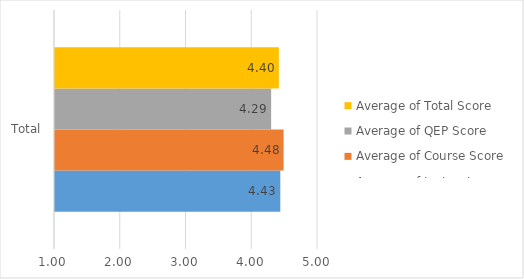
| Category | Average of Instructor Score | Average of Course Score | Average of QEP Score | Average of Total Score |
|---|---|---|---|---|
| Total | 4.427 | 4.477 | 4.287 | 4.405 |